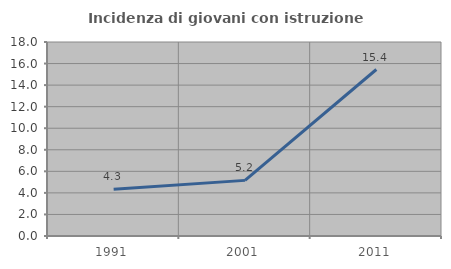
| Category | Incidenza di giovani con istruzione universitaria |
|---|---|
| 1991.0 | 4.348 |
| 2001.0 | 5.161 |
| 2011.0 | 15.447 |